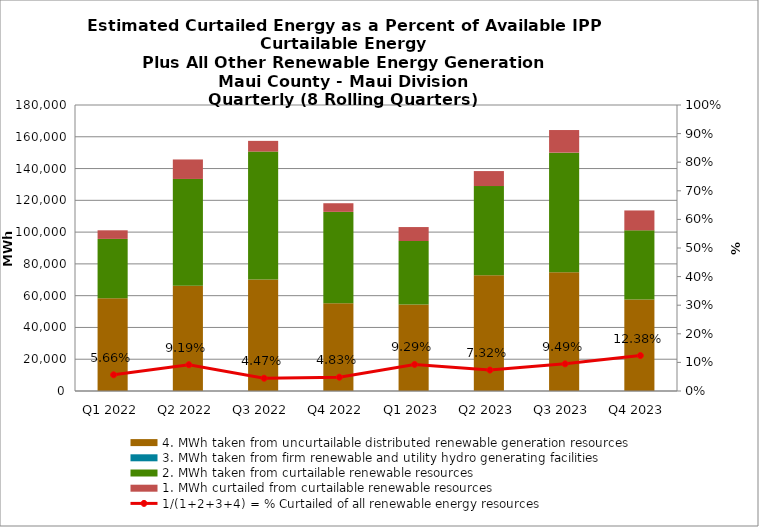
| Category | 4. MWh taken from uncurtailable distributed renewable generation resources | 3. MWh taken from firm renewable and utility hydro generating facilities | 2. MWh taken from curtailable renewable resources | 1. MWh curtailed from curtailable renewable resources |
|---|---|---|---|---|
| Q1 2022 | 58442.956 | 0 | 37278.35 | 5418.479 |
| Q2 2022 | 66313.825 | 0 | 67141.528 | 12262.436 |
| Q3 2022 | 70236.876 | 0 | 80449.999 | 6736.668 |
| Q4 2022 | 55269.255 | 0 | 57464.618 | 5439.912 |
| Q1 2023 | 54448.509 | 0 | 39966.303 | 8768.507 |
| Q2 2023 | 72857.463 | 0 | 56123.445 | 9436.915 |
| Q3 2023 | 74764.653 | 0 | 75238.832 | 14240.357 |
| Q4 2023 | 57603.424 | 0 | 43507.15 | 12521.6 |